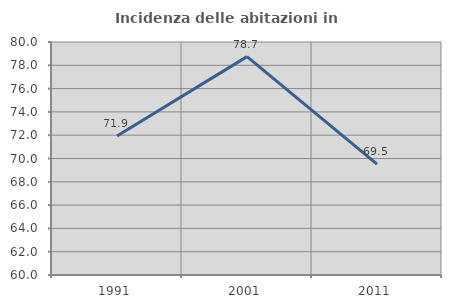
| Category | Incidenza delle abitazioni in proprietà  |
|---|---|
| 1991.0 | 71.931 |
| 2001.0 | 78.746 |
| 2011.0 | 69.521 |